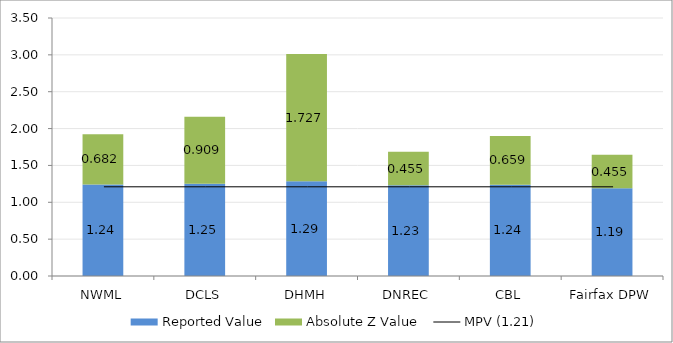
| Category | Reported Value | Absolute Z Value  |
|---|---|---|
| NWML | 1.24 | 0.682 |
| DCLS | 1.25 | 0.909 |
| DHMH | 1.286 | 1.727 |
| DNREC | 1.23 | 0.455 |
| CBL | 1.239 | 0.659 |
| Fairfax DPW | 1.19 | 0.455 |